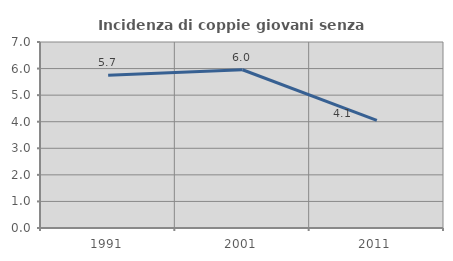
| Category | Incidenza di coppie giovani senza figli |
|---|---|
| 1991.0 | 5.745 |
| 2001.0 | 5.955 |
| 2011.0 | 4.05 |